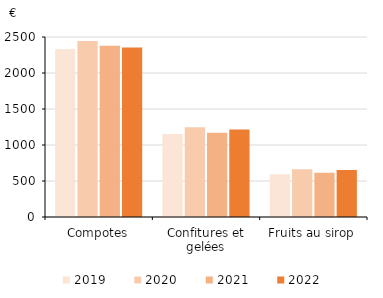
| Category | 2019 | 2020 | 2021 | 2022 |
|---|---|---|---|---|
| Compotes | 2332 | 2445 | 2378 | 2354 |
| Confitures et gelées | 1152.1 | 1246.4 | 1170.6 | 1214 |
| Fruits au sirop | 595 | 664.5 | 612.9 | 654.5 |